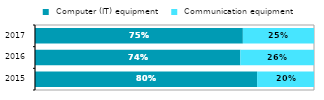
| Category |  Computer (IT) equipment |  Communication equipment |
|---|---|---|
| 2015 | 0.796 | 0.204 |
| 2016 | 0.736 | 0.264 |
| 2017 | 0.745 | 0.255 |